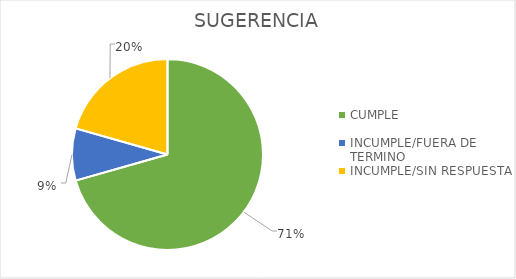
| Category | Series 0 |
|---|---|
| CUMPLE | 24 |
| INCUMPLE/FUERA DE TERMINO | 3 |
| INCUMPLE/SIN RESPUESTA | 7 |